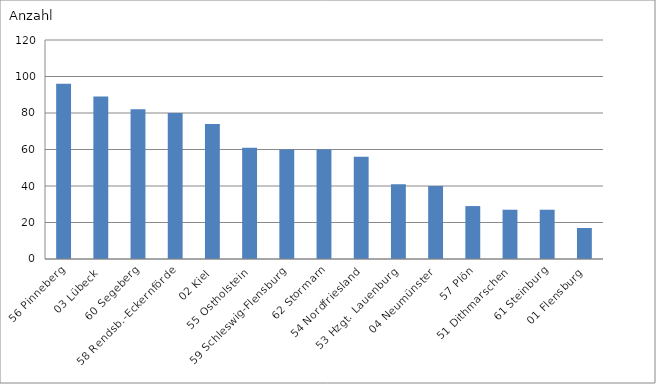
| Category | 56 Pinneberg |
|---|---|
| 56 Pinneberg | 96 |
| 03 Lübeck | 89 |
| 60 Segeberg | 82 |
| 58 Rendsb.-Eckernförde | 80 |
| 02 Kiel | 74 |
| 55 Ostholstein | 61 |
| 59 Schleswig-Flensburg | 60 |
| 62 Stormarn | 60 |
| 54 Nordfriesland | 56 |
| 53 Hzgt. Lauenburg | 41 |
| 04 Neumünster | 40 |
| 57 Plön | 29 |
| 51 Dithmarschen | 27 |
| 61 Steinburg | 27 |
| 01 Flensburg | 17 |